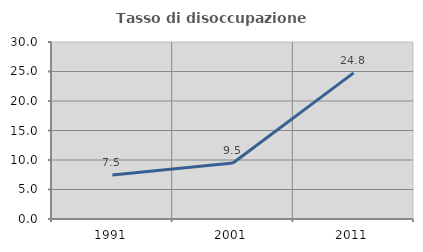
| Category | Tasso di disoccupazione giovanile  |
|---|---|
| 1991.0 | 7.452 |
| 2001.0 | 9.494 |
| 2011.0 | 24.771 |